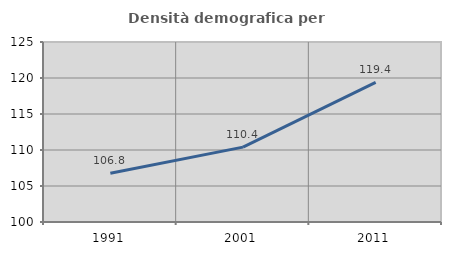
| Category | Densità demografica |
|---|---|
| 1991.0 | 106.78 |
| 2001.0 | 110.398 |
| 2011.0 | 119.381 |